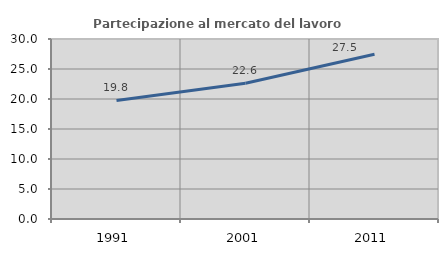
| Category | Partecipazione al mercato del lavoro  femminile |
|---|---|
| 1991.0 | 19.758 |
| 2001.0 | 22.633 |
| 2011.0 | 27.457 |